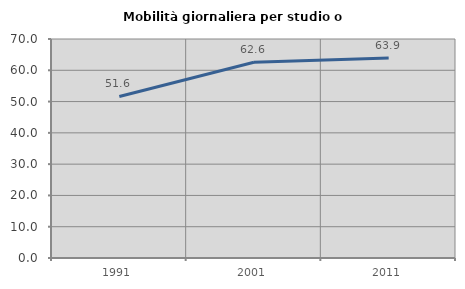
| Category | Mobilità giornaliera per studio o lavoro |
|---|---|
| 1991.0 | 51.639 |
| 2001.0 | 62.57 |
| 2011.0 | 63.907 |